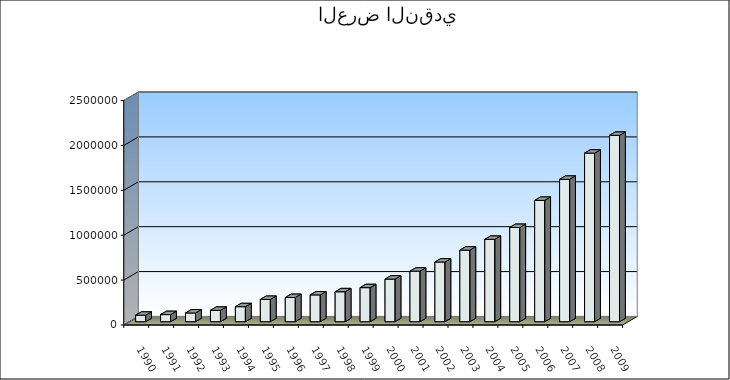
| Category | عرض النقدي |
|---|---|
| 1990.0 | 72515 |
| 1991.0 | 79340.6 |
| 1992.0 | 97179.5 |
| 1993.0 | 126994.9 |
| 1994.0 | 167169.3 |
| 1995.0 | 248264.9 |
| 1996.0 | 269551.3 |
| 1997.0 | 298388.5 |
| 1998.0 | 333349.9 |
| 1999.0 | 379294.2 |
| 2000.0 | 474525.1 |
| 2001.0 | 563049.5 |
| 2002.0 | 664664.4 |
| 2003.0 | 797371.8 |
| 2004.0 | 917275.3 |
| 2005.0 | 1049508.8 |
| 2006.0 | 1351429.8 |
| 2007.0 | 1586221.3 |
| 2008.0 | 1877477.4 |
| 2009.0 | 2075798.7 |